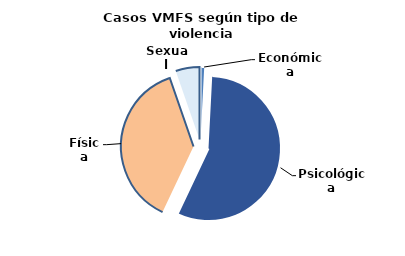
| Category | Series 0 |
|---|---|
| Económica | 136 |
| Psicológica | 9312 |
| Física | 6242 |
| Sexual | 879 |